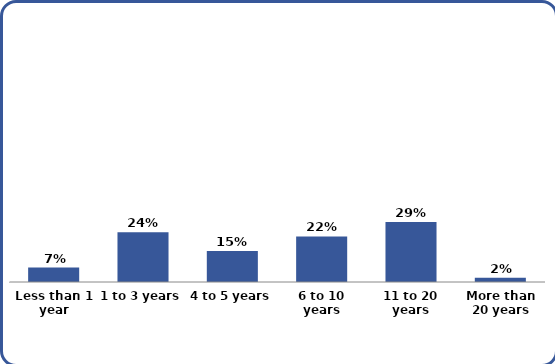
| Category | Series 0 |
|---|---|
| Less than 1 year | 0.07 |
| 1 to 3 years | 0.24 |
| 4 to 5 years | 0.15 |
| 6 to 10 years | 0.22 |
| 11 to 20 years | 0.29 |
| More than 20 years | 0.02 |